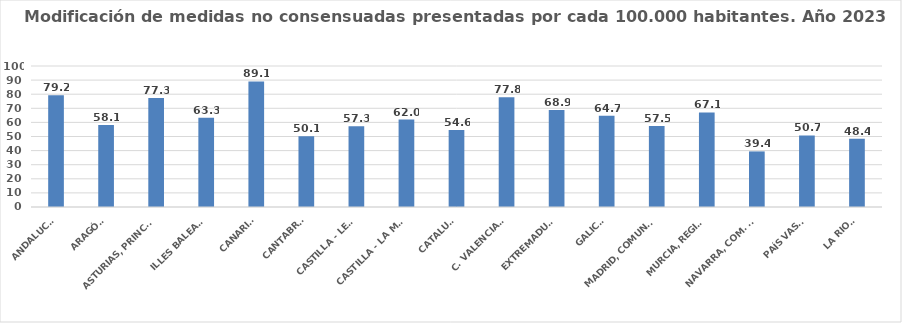
| Category | Series 0 |
|---|---|
| ANDALUCÍA | 79.21 |
| ARAGÓN | 58.103 |
| ASTURIAS, PRINCIPADO | 77.29 |
| ILLES BALEARS | 63.312 |
| CANARIAS | 89.068 |
| CANTABRIA | 50.125 |
| CASTILLA - LEÓN | 57.333 |
| CASTILLA - LA MANCHA | 62.049 |
| CATALUÑA | 54.563 |
| C. VALENCIANA | 77.823 |
| EXTREMADURA | 68.861 |
| GALICIA | 64.673 |
| MADRID, COMUNIDAD | 57.527 |
| MURCIA, REGIÓN | 67.11 |
| NAVARRA, COM. FORAL | 39.423 |
| PAÍS VASCO | 50.723 |
| LA RIOJA | 48.408 |